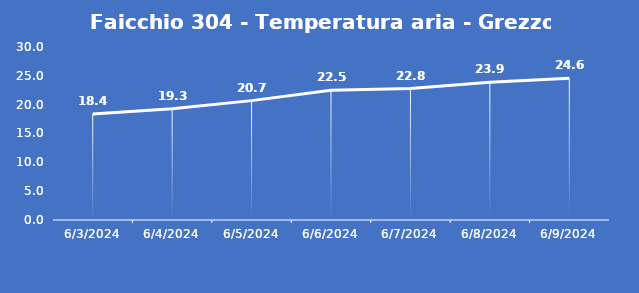
| Category | Faicchio 304 - Temperatura aria - Grezzo (°C) |
|---|---|
| 6/3/24 | 18.4 |
| 6/4/24 | 19.3 |
| 6/5/24 | 20.7 |
| 6/6/24 | 22.5 |
| 6/7/24 | 22.8 |
| 6/8/24 | 23.9 |
| 6/9/24 | 24.6 |